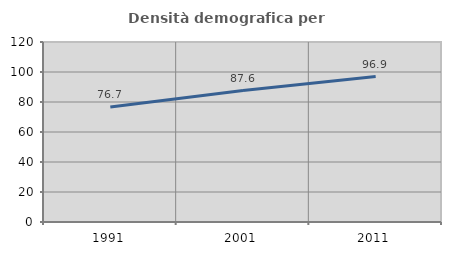
| Category | Densità demografica |
|---|---|
| 1991.0 | 76.714 |
| 2001.0 | 87.618 |
| 2011.0 | 96.937 |